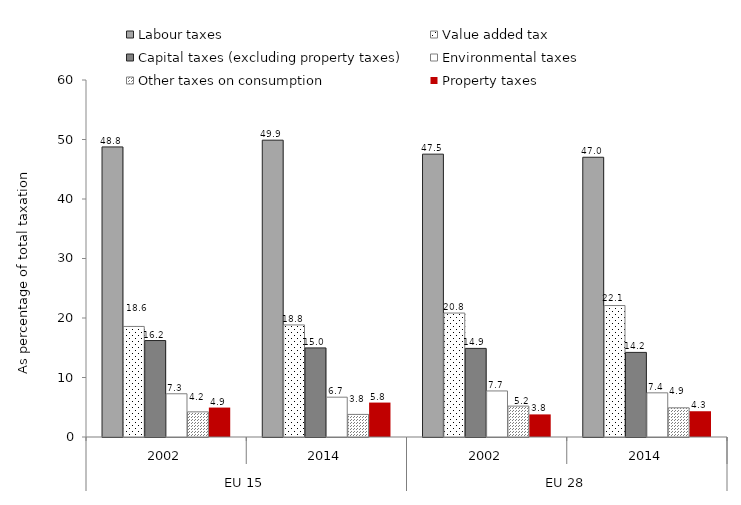
| Category | Labour taxes | Value added tax | Capital taxes (excluding property taxes) | Environmental taxes | Other taxes on consumption | Property taxes |
|---|---|---|---|---|---|---|
| 0 | 48.752 | 18.579 | 16.211 | 7.266 | 4.225 | 4.946 |
| 1 | 49.885 | 18.836 | 14.975 | 6.693 | 3.796 | 5.786 |
| 2 | 47.537 | 20.833 | 14.891 | 7.74 | 5.189 | 3.798 |
| 3 | 47.016 | 22.094 | 14.218 | 7.422 | 4.905 | 4.329 |